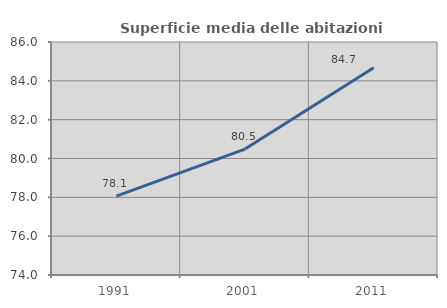
| Category | Superficie media delle abitazioni occupate |
|---|---|
| 1991.0 | 78.06 |
| 2001.0 | 80.485 |
| 2011.0 | 84.675 |